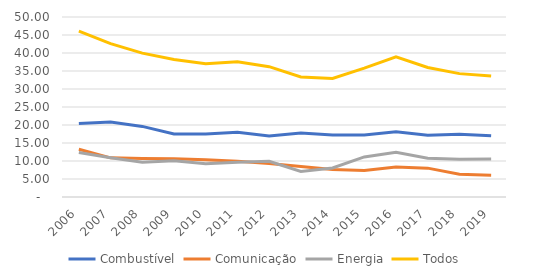
| Category | Combustível | Comunicação | Energia | Todos |
|---|---|---|---|---|
| 2006.0 | 20.45 | 13.27 | 12.34 | 46.06 |
| 2007.0 | 20.82 | 10.87 | 10.93 | 42.62 |
| 2008.0 | 19.61 | 10.68 | 9.67 | 39.96 |
| 2009.0 | 17.49 | 10.63 | 10.05 | 38.17 |
| 2010.0 | 17.47 | 10.35 | 9.22 | 37.04 |
| 2011.0 | 17.97 | 9.93 | 9.64 | 37.54 |
| 2012.0 | 16.97 | 9.32 | 9.92 | 36.21 |
| 2013.0 | 17.81 | 8.46 | 7.08 | 33.35 |
| 2014.0 | 17.23 | 7.65 | 8.06 | 32.94 |
| 2015.0 | 17.25 | 7.39 | 11.14 | 35.78 |
| 2016.0 | 18.13 | 8.34 | 12.45 | 38.92 |
| 2017.0 | 17.18 | 8.02 | 10.78 | 35.98 |
| 2018.0 | 17.45 | 6.34 | 10.48 | 34.27 |
| 2019.0 | 17.02 | 6.06 | 10.56 | 33.64 |